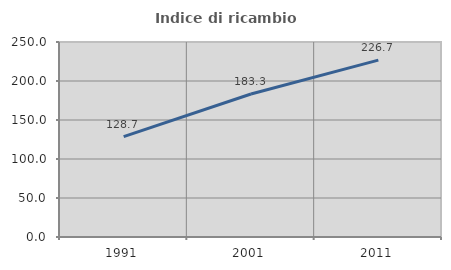
| Category | Indice di ricambio occupazionale  |
|---|---|
| 1991.0 | 128.706 |
| 2001.0 | 183.333 |
| 2011.0 | 226.73 |